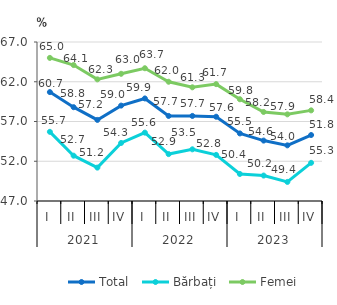
| Category | Total | Bărbați | Femei |
|---|---|---|---|
| 0 | 60.7 | 55.7 | 65 |
| 1 | 58.8 | 52.7 | 64.1 |
| 2 | 57.2 | 51.2 | 62.3 |
| 3 | 59 | 54.3 | 63 |
| 4 | 59.9 | 55.6 | 63.7 |
| 5 | 57.7 | 52.9 | 62 |
| 6 | 57.7 | 53.5 | 61.3 |
| 7 | 57.6 | 52.8 | 61.7 |
| 8 | 55.5 | 50.4 | 59.8 |
| 9 | 54.6 | 50.2 | 58.2 |
| 10 | 54 | 49.4 | 57.9 |
| 11 | 55.3 | 51.8 | 58.4 |